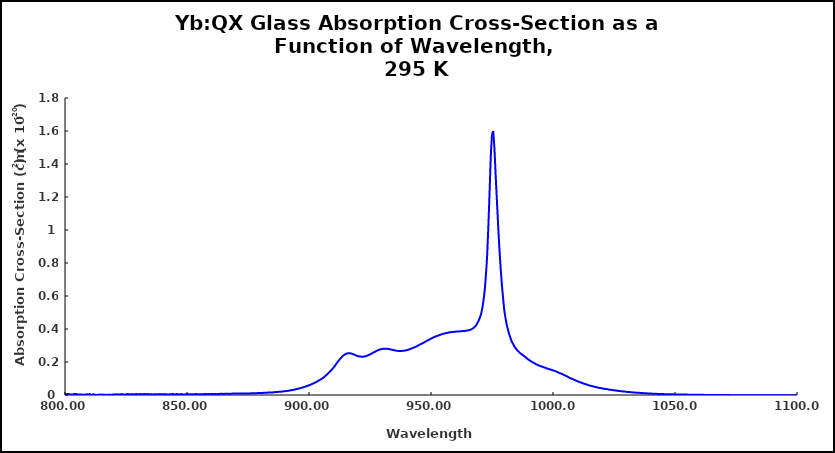
| Category | 295 K |
|---|---|
| 800.0 | 0.007 |
| 800.5 | 0.005 |
| 801.0 | 0.006 |
| 801.5 | 0.006 |
| 802.0 | 0.001 |
| 802.5 | 0.004 |
| 803.0 | 0.001 |
| 803.5 | 0.006 |
| 804.0 | 0.006 |
| 804.5 | 0.007 |
| 805.0 | 0.004 |
| 805.5 | 0.002 |
| 806.0 | 0.003 |
| 806.5 | 0.003 |
| 807.0 | 0.002 |
| 807.5 | 0.001 |
| 808.0 | 0.001 |
| 808.5 | 0.003 |
| 809.0 | 0.005 |
| 809.5 | 0.001 |
| 810.0 | 0.007 |
| 810.5 | 0.002 |
| 811.0 | 0 |
| 811.5 | 0.005 |
| 812.0 | 0.002 |
| 812.5 | 0.001 |
| 813.0 | 0 |
| 813.5 | 0.002 |
| 814.0 | 0.002 |
| 814.5 | 0.003 |
| 815.0 | 0 |
| 815.5 | 0.003 |
| 816.0 | 0.002 |
| 816.5 | 0.001 |
| 817.0 | 0 |
| 817.5 | 0.001 |
| 818.0 | 0.002 |
| 818.5 | 0.002 |
| 819.0 | 0.001 |
| 819.5 | 0.002 |
| 820.0 | 0.004 |
| 820.5 | 0.002 |
| 821.0 | 0.005 |
| 821.5 | 0.003 |
| 822.0 | 0.004 |
| 822.5 | 0.003 |
| 823.0 | 0.005 |
| 823.5 | 0.005 |
| 824.0 | 0.003 |
| 824.5 | 0.002 |
| 825.0 | 0.004 |
| 825.5 | 0.006 |
| 826.0 | 0.005 |
| 826.5 | 0.005 |
| 827.0 | 0.005 |
| 827.5 | 0.005 |
| 828.0 | 0.004 |
| 828.5 | 0.003 |
| 829.0 | 0.006 |
| 829.5 | 0.005 |
| 830.0 | 0.005 |
| 830.5 | 0.004 |
| 831.0 | 0.006 |
| 831.5 | 0.004 |
| 832.0 | 0.005 |
| 832.5 | 0.006 |
| 833.0 | 0.005 |
| 833.5 | 0.004 |
| 834.0 | 0.006 |
| 834.5 | 0.004 |
| 835.0 | 0.004 |
| 835.5 | 0.004 |
| 836.0 | 0.003 |
| 836.5 | 0.005 |
| 837.0 | 0.005 |
| 837.5 | 0.005 |
| 838.0 | 0.004 |
| 838.5 | 0.004 |
| 839.0 | 0.004 |
| 839.5 | 0.004 |
| 840.0 | 0.004 |
| 840.5 | 0.004 |
| 841.0 | 0.004 |
| 841.5 | 0.004 |
| 842.0 | 0.003 |
| 842.5 | 0.004 |
| 843.0 | 0.004 |
| 843.5 | 0.003 |
| 844.0 | 0.006 |
| 844.5 | 0.005 |
| 845.0 | 0.002 |
| 845.5 | 0.005 |
| 846.0 | 0.006 |
| 846.5 | 0.003 |
| 847.0 | 0.003 |
| 847.5 | 0.006 |
| 848.0 | 0.005 |
| 848.5 | 0.003 |
| 849.0 | 0.003 |
| 849.5 | 0.005 |
| 850.0 | 0.005 |
| 850.5 | 0.005 |
| 851.0 | 0.003 |
| 851.5 | 0.005 |
| 852.0 | 0.005 |
| 852.5 | 0.004 |
| 853.0 | 0.004 |
| 853.5 | 0.007 |
| 854.0 | 0.005 |
| 854.5 | 0.005 |
| 855.0 | 0.004 |
| 855.5 | 0.004 |
| 856.0 | 0.005 |
| 856.5 | 0.005 |
| 857.0 | 0.005 |
| 857.5 | 0.006 |
| 858.0 | 0.005 |
| 858.5 | 0.005 |
| 859.0 | 0.006 |
| 859.5 | 0.005 |
| 860.0 | 0.006 |
| 860.5 | 0.006 |
| 861.0 | 0.005 |
| 861.5 | 0.006 |
| 862.0 | 0.005 |
| 862.5 | 0.007 |
| 863.0 | 0.005 |
| 863.5 | 0.006 |
| 864.0 | 0.008 |
| 864.5 | 0.007 |
| 865.0 | 0.007 |
| 865.5 | 0.007 |
| 866.0 | 0.007 |
| 866.5 | 0.008 |
| 867.0 | 0.006 |
| 867.5 | 0.008 |
| 868.0 | 0.008 |
| 868.5 | 0.008 |
| 869.0 | 0.009 |
| 869.5 | 0.009 |
| 870.0 | 0.009 |
| 870.5 | 0.009 |
| 871.0 | 0.008 |
| 871.5 | 0.009 |
| 872.0 | 0.009 |
| 872.5 | 0.009 |
| 873.0 | 0.009 |
| 873.5 | 0.009 |
| 874.0 | 0.009 |
| 874.5 | 0.01 |
| 875.0 | 0.01 |
| 875.5 | 0.01 |
| 876.0 | 0.01 |
| 876.5 | 0.01 |
| 877.0 | 0.01 |
| 877.5 | 0.011 |
| 878.0 | 0.011 |
| 878.5 | 0.011 |
| 879.0 | 0.012 |
| 879.5 | 0.012 |
| 880.0 | 0.012 |
| 880.5 | 0.012 |
| 881.0 | 0.012 |
| 881.5 | 0.013 |
| 882.0 | 0.014 |
| 882.5 | 0.014 |
| 883.0 | 0.014 |
| 883.5 | 0.014 |
| 884.0 | 0.015 |
| 884.5 | 0.015 |
| 885.0 | 0.016 |
| 885.5 | 0.016 |
| 886.0 | 0.017 |
| 886.5 | 0.018 |
| 887.0 | 0.018 |
| 887.5 | 0.019 |
| 888.0 | 0.019 |
| 888.5 | 0.02 |
| 889.0 | 0.021 |
| 889.5 | 0.022 |
| 890.0 | 0.023 |
| 890.5 | 0.024 |
| 891.0 | 0.025 |
| 891.5 | 0.026 |
| 892.0 | 0.027 |
| 892.5 | 0.028 |
| 893.0 | 0.03 |
| 893.5 | 0.031 |
| 894.0 | 0.033 |
| 894.5 | 0.034 |
| 895.0 | 0.036 |
| 895.5 | 0.038 |
| 896.0 | 0.04 |
| 896.5 | 0.042 |
| 897.0 | 0.044 |
| 897.5 | 0.046 |
| 898.0 | 0.048 |
| 898.5 | 0.051 |
| 899.0 | 0.053 |
| 899.5 | 0.056 |
| 900.0 | 0.059 |
| 900.5 | 0.061 |
| 901.0 | 0.065 |
| 901.5 | 0.068 |
| 902.0 | 0.072 |
| 902.5 | 0.075 |
| 903.0 | 0.079 |
| 903.5 | 0.084 |
| 904.0 | 0.088 |
| 904.5 | 0.092 |
| 905.0 | 0.097 |
| 905.5 | 0.102 |
| 906.0 | 0.106 |
| 906.5 | 0.113 |
| 907.0 | 0.119 |
| 907.5 | 0.126 |
| 908.0 | 0.133 |
| 908.5 | 0.14 |
| 909.0 | 0.148 |
| 909.5 | 0.157 |
| 910.0 | 0.165 |
| 910.5 | 0.174 |
| 911.0 | 0.185 |
| 911.5 | 0.196 |
| 912.0 | 0.205 |
| 912.5 | 0.215 |
| 913.0 | 0.223 |
| 913.5 | 0.231 |
| 914.0 | 0.238 |
| 914.5 | 0.244 |
| 915.0 | 0.248 |
| 915.5 | 0.252 |
| 916.0 | 0.253 |
| 916.5 | 0.253 |
| 917.0 | 0.252 |
| 917.5 | 0.251 |
| 918.0 | 0.248 |
| 918.5 | 0.245 |
| 919.0 | 0.242 |
| 919.5 | 0.239 |
| 920.0 | 0.235 |
| 920.5 | 0.234 |
| 921.0 | 0.233 |
| 921.5 | 0.232 |
| 922.0 | 0.232 |
| 922.5 | 0.233 |
| 923.0 | 0.234 |
| 923.5 | 0.236 |
| 924.0 | 0.239 |
| 924.5 | 0.243 |
| 925.0 | 0.246 |
| 925.5 | 0.25 |
| 926.0 | 0.254 |
| 926.5 | 0.258 |
| 927.0 | 0.262 |
| 927.5 | 0.266 |
| 928.0 | 0.27 |
| 928.5 | 0.272 |
| 929.0 | 0.275 |
| 929.5 | 0.278 |
| 930.0 | 0.279 |
| 930.5 | 0.28 |
| 931.0 | 0.281 |
| 931.5 | 0.28 |
| 932.0 | 0.28 |
| 932.5 | 0.279 |
| 933.0 | 0.277 |
| 933.5 | 0.276 |
| 934.0 | 0.275 |
| 934.5 | 0.273 |
| 935.0 | 0.271 |
| 935.5 | 0.269 |
| 936.0 | 0.268 |
| 936.5 | 0.267 |
| 937.0 | 0.267 |
| 937.5 | 0.267 |
| 938.0 | 0.267 |
| 938.5 | 0.268 |
| 939.0 | 0.269 |
| 939.5 | 0.27 |
| 940.0 | 0.271 |
| 940.5 | 0.274 |
| 941.0 | 0.276 |
| 941.5 | 0.279 |
| 942.0 | 0.282 |
| 942.5 | 0.285 |
| 943.0 | 0.288 |
| 943.5 | 0.291 |
| 944.0 | 0.294 |
| 944.5 | 0.298 |
| 945.0 | 0.302 |
| 945.5 | 0.306 |
| 946.0 | 0.31 |
| 946.5 | 0.313 |
| 947.0 | 0.317 |
| 947.5 | 0.322 |
| 948.0 | 0.326 |
| 948.5 | 0.33 |
| 949.0 | 0.333 |
| 949.5 | 0.338 |
| 950.0 | 0.342 |
| 950.5 | 0.345 |
| 951.0 | 0.349 |
| 951.5 | 0.353 |
| 952.0 | 0.355 |
| 952.5 | 0.358 |
| 953.0 | 0.36 |
| 953.5 | 0.363 |
| 954.0 | 0.366 |
| 954.5 | 0.368 |
| 955.0 | 0.371 |
| 955.5 | 0.373 |
| 956.0 | 0.375 |
| 956.5 | 0.376 |
| 957.0 | 0.378 |
| 957.5 | 0.379 |
| 958.0 | 0.381 |
| 958.5 | 0.382 |
| 959.0 | 0.382 |
| 959.5 | 0.383 |
| 960.0 | 0.384 |
| 960.5 | 0.384 |
| 961.0 | 0.385 |
| 961.5 | 0.385 |
| 962.0 | 0.386 |
| 962.5 | 0.386 |
| 963.0 | 0.387 |
| 963.5 | 0.388 |
| 964.0 | 0.389 |
| 964.5 | 0.39 |
| 965.0 | 0.391 |
| 965.5 | 0.393 |
| 966.0 | 0.395 |
| 966.5 | 0.398 |
| 967.0 | 0.402 |
| 967.5 | 0.408 |
| 968.0 | 0.415 |
| 968.5 | 0.423 |
| 969.0 | 0.436 |
| 969.5 | 0.45 |
| 970.0 | 0.468 |
| 970.5 | 0.49 |
| 971.0 | 0.524 |
| 971.5 | 0.572 |
| 972.0 | 0.634 |
| 972.5 | 0.728 |
| 973.0 | 0.842 |
| 973.5 | 1.018 |
| 974.0 | 1.226 |
| 974.5 | 1.444 |
| 975.0 | 1.579 |
| 975.5 | 1.6 |
| 976.0 | 1.497 |
| 976.5 | 1.331 |
| 977.0 | 1.181 |
| 977.5 | 1.035 |
| 978.0 | 0.894 |
| 978.5 | 0.778 |
| 979.0 | 0.677 |
| 979.5 | 0.596 |
| 980.0 | 0.518 |
| 980.5 | 0.47 |
| 981.0 | 0.428 |
| 981.5 | 0.399 |
| 982.0 | 0.371 |
| 982.5 | 0.349 |
| 983.0 | 0.327 |
| 983.5 | 0.313 |
| 984.0 | 0.299 |
| 984.5 | 0.287 |
| 985.0 | 0.277 |
| 985.5 | 0.269 |
| 986.0 | 0.262 |
| 986.5 | 0.254 |
| 987.0 | 0.248 |
| 987.5 | 0.243 |
| 988.0 | 0.238 |
| 988.5 | 0.232 |
| 989.0 | 0.226 |
| 989.5 | 0.22 |
| 990.0 | 0.214 |
| 990.5 | 0.209 |
| 991.0 | 0.204 |
| 991.5 | 0.2 |
| 992.0 | 0.196 |
| 992.5 | 0.192 |
| 993.0 | 0.187 |
| 993.5 | 0.184 |
| 994.0 | 0.18 |
| 994.5 | 0.178 |
| 995.0 | 0.175 |
| 995.5 | 0.172 |
| 996.0 | 0.169 |
| 996.5 | 0.167 |
| 997.0 | 0.164 |
| 997.5 | 0.161 |
| 998.0 | 0.159 |
| 998.5 | 0.156 |
| 999.0 | 0.154 |
| 999.5 | 0.152 |
| 1000.0 | 0.149 |
| 1000.5 | 0.147 |
| 1001.0 | 0.144 |
| 1001.5 | 0.141 |
| 1002.0 | 0.138 |
| 1002.5 | 0.135 |
| 1003.0 | 0.132 |
| 1003.5 | 0.129 |
| 1004.0 | 0.125 |
| 1004.5 | 0.122 |
| 1005.0 | 0.118 |
| 1005.5 | 0.115 |
| 1006.0 | 0.111 |
| 1006.5 | 0.107 |
| 1007.0 | 0.103 |
| 1007.5 | 0.1 |
| 1008.0 | 0.097 |
| 1008.5 | 0.093 |
| 1009.0 | 0.09 |
| 1009.5 | 0.087 |
| 1010.0 | 0.083 |
| 1010.5 | 0.08 |
| 1011.0 | 0.078 |
| 1011.5 | 0.075 |
| 1012.0 | 0.072 |
| 1012.5 | 0.07 |
| 1013.0 | 0.067 |
| 1013.5 | 0.065 |
| 1014.0 | 0.063 |
| 1014.5 | 0.06 |
| 1015.0 | 0.058 |
| 1015.5 | 0.056 |
| 1016.0 | 0.054 |
| 1016.5 | 0.052 |
| 1017.0 | 0.05 |
| 1017.5 | 0.049 |
| 1018.0 | 0.047 |
| 1018.5 | 0.045 |
| 1019.0 | 0.043 |
| 1019.5 | 0.042 |
| 1020.0 | 0.041 |
| 1020.5 | 0.039 |
| 1021.0 | 0.038 |
| 1021.5 | 0.037 |
| 1022.0 | 0.035 |
| 1022.5 | 0.034 |
| 1023.0 | 0.033 |
| 1023.5 | 0.032 |
| 1024.0 | 0.031 |
| 1024.5 | 0.03 |
| 1025.0 | 0.028 |
| 1025.5 | 0.028 |
| 1026.0 | 0.027 |
| 1026.5 | 0.026 |
| 1027.0 | 0.025 |
| 1027.5 | 0.024 |
| 1028.0 | 0.023 |
| 1028.5 | 0.022 |
| 1029.0 | 0.021 |
| 1029.5 | 0.02 |
| 1030.0 | 0.019 |
| 1030.5 | 0.019 |
| 1031.0 | 0.018 |
| 1031.5 | 0.018 |
| 1032.0 | 0.017 |
| 1032.5 | 0.016 |
| 1033.0 | 0.016 |
| 1033.5 | 0.015 |
| 1034.0 | 0.014 |
| 1034.5 | 0.014 |
| 1035.0 | 0.013 |
| 1035.5 | 0.013 |
| 1036.0 | 0.012 |
| 1036.5 | 0.012 |
| 1037.0 | 0.011 |
| 1037.5 | 0.011 |
| 1038.0 | 0.01 |
| 1038.5 | 0.01 |
| 1039.0 | 0.01 |
| 1039.5 | 0.009 |
| 1040.0 | 0.009 |
| 1040.5 | 0.008 |
| 1041.0 | 0.008 |
| 1041.5 | 0.008 |
| 1042.0 | 0.007 |
| 1042.5 | 0.007 |
| 1043.0 | 0.006 |
| 1043.5 | 0.006 |
| 1044.0 | 0.006 |
| 1044.5 | 0.006 |
| 1045.0 | 0.006 |
| 1045.5 | 0.005 |
| 1046.0 | 0.005 |
| 1046.5 | 0.005 |
| 1047.0 | 0.005 |
| 1047.5 | 0.004 |
| 1048.0 | 0.004 |
| 1048.5 | 0.004 |
| 1049.0 | 0.004 |
| 1049.5 | 0.004 |
| 1050.0 | 0.004 |
| 1050.5 | 0.003 |
| 1051.0 | 0.003 |
| 1051.5 | 0.003 |
| 1052.0 | 0.003 |
| 1052.5 | 0.003 |
| 1053.0 | 0.003 |
| 1053.5 | 0.003 |
| 1054.0 | 0.002 |
| 1054.5 | 0.002 |
| 1055.0 | 0.002 |
| 1055.5 | 0.002 |
| 1056.0 | 0.002 |
| 1056.5 | 0.002 |
| 1057.0 | 0.002 |
| 1057.5 | 0.002 |
| 1058.0 | 0.001 |
| 1058.5 | 0.001 |
| 1059.0 | 0.001 |
| 1059.5 | 0.001 |
| 1060.0 | 0.001 |
| 1060.5 | 0.001 |
| 1061.0 | 0.001 |
| 1061.5 | 0.001 |
| 1062.0 | 0.001 |
| 1062.5 | 0.001 |
| 1063.0 | 0 |
| 1063.5 | 0 |
| 1064.0 | 0 |
| 1064.5 | 0 |
| 1065.0 | 0 |
| 1065.5 | 0 |
| 1066.0 | 0 |
| 1066.5 | 0 |
| 1067.0 | 0 |
| 1067.5 | 0 |
| 1068.0 | 0 |
| 1068.5 | 0 |
| 1069.0 | -0.001 |
| 1069.5 | -0.001 |
| 1070.0 | -0.001 |
| 1070.5 | -0.001 |
| 1071.0 | -0.001 |
| 1071.5 | -0.001 |
| 1072.0 | -0.001 |
| 1072.5 | -0.001 |
| 1073.0 | -0.001 |
| 1073.5 | -0.001 |
| 1074.0 | -0.001 |
| 1074.5 | -0.001 |
| 1075.0 | -0.001 |
| 1075.5 | -0.001 |
| 1076.0 | -0.001 |
| 1076.5 | -0.001 |
| 1077.0 | -0.001 |
| 1077.5 | -0.001 |
| 1078.0 | -0.001 |
| 1078.5 | -0.001 |
| 1079.0 | -0.001 |
| 1079.5 | -0.001 |
| 1080.0 | -0.001 |
| 1080.5 | -0.001 |
| 1081.0 | -0.001 |
| 1081.5 | -0.001 |
| 1082.0 | -0.001 |
| 1082.5 | -0.001 |
| 1083.0 | -0.001 |
| 1083.5 | -0.001 |
| 1084.0 | -0.001 |
| 1084.5 | -0.002 |
| 1085.0 | -0.001 |
| 1085.5 | -0.001 |
| 1086.0 | -0.001 |
| 1086.5 | -0.001 |
| 1087.0 | -0.001 |
| 1087.5 | -0.001 |
| 1088.0 | -0.001 |
| 1088.5 | -0.002 |
| 1089.0 | -0.001 |
| 1089.5 | -0.001 |
| 1090.0 | -0.002 |
| 1090.5 | -0.002 |
| 1091.0 | -0.002 |
| 1091.5 | -0.001 |
| 1092.0 | -0.002 |
| 1092.5 | -0.002 |
| 1093.0 | -0.002 |
| 1093.5 | -0.002 |
| 1094.0 | -0.002 |
| 1094.5 | -0.002 |
| 1095.0 | -0.001 |
| 1095.5 | -0.002 |
| 1096.0 | -0.002 |
| 1096.5 | -0.002 |
| 1097.0 | -0.002 |
| 1097.5 | -0.002 |
| 1098.0 | -0.001 |
| 1098.5 | -0.002 |
| 1099.0 | -0.001 |
| 1099.5 | -0.002 |
| 1100.0 | -0.001 |